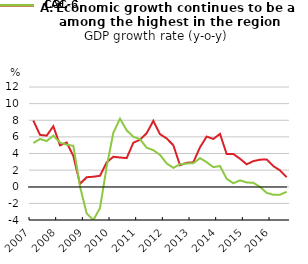
| Category | COL |
|---|---|
| 2007.0 | 7.957 |
| nan | 6.243 |
| nan | 6.149 |
| nan | 7.28 |
| 2008.0 | 4.981 |
| nan | 5.324 |
| nan | 3.699 |
| nan | 0.339 |
| 2009.0 | 1.149 |
| nan | 1.202 |
| nan | 1.323 |
| nan | 2.932 |
| 2010.0 | 3.607 |
| nan | 3.518 |
| nan | 3.445 |
| nan | 5.298 |
| 2011.0 | 5.652 |
| nan | 6.441 |
| nan | 7.931 |
| nan | 6.326 |
| 2012.0 | 5.809 |
| nan | 4.992 |
| nan | 2.583 |
| nan | 2.886 |
| 2013.0 | 2.94 |
| nan | 4.745 |
| nan | 6.039 |
| nan | 5.75 |
| 2014.0 | 6.359 |
| nan | 3.943 |
| nan | 3.943 |
| nan | 3.373 |
| 2015.0 | 2.699 |
| nan | 3.084 |
| nan | 3.255 |
| nan | 3.291 |
| 2016.0 | 2.484 |
| nan | 1.967 |
| nan | 1.15 |